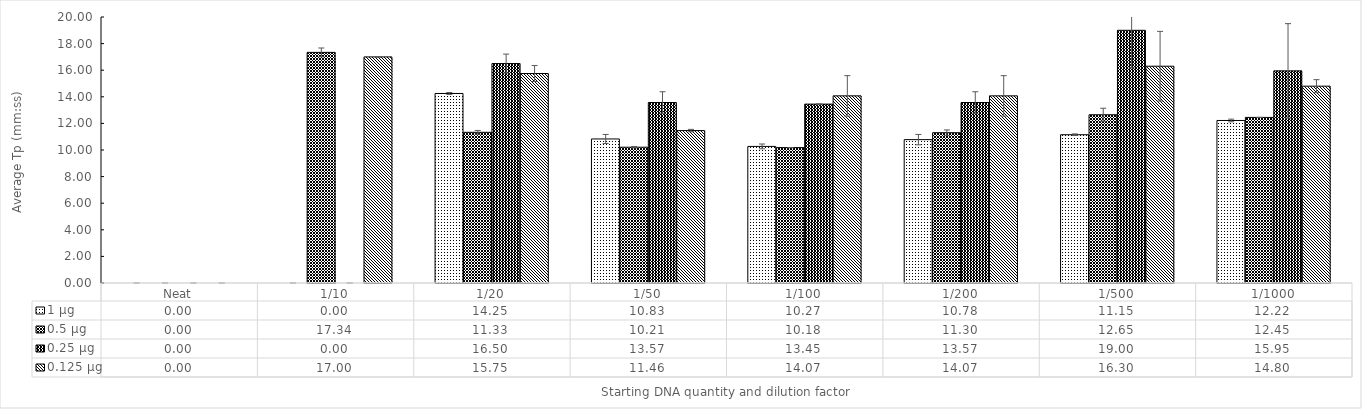
| Category | 1 µg | 0.5 µg | 0.25 µg | 0.125 µg |
|---|---|---|---|---|
| Neat | 0 | 0 | 0 | 0 |
| 1/10 | 0 | 17.34 | 0 | 17 |
| 1/20 | 14.25 | 11.33 | 16.5 | 15.75 |
| 1/50 | 10.83 | 10.21 | 13.57 | 11.46 |
| 1/100 | 10.27 | 10.18 | 13.45 | 14.07 |
| 1/200 | 10.78 | 11.3 | 13.57 | 14.07 |
| 1/500 | 11.15 | 12.65 | 19 | 16.3 |
| 1/1000 | 12.22 | 12.45 | 15.95 | 14.8 |